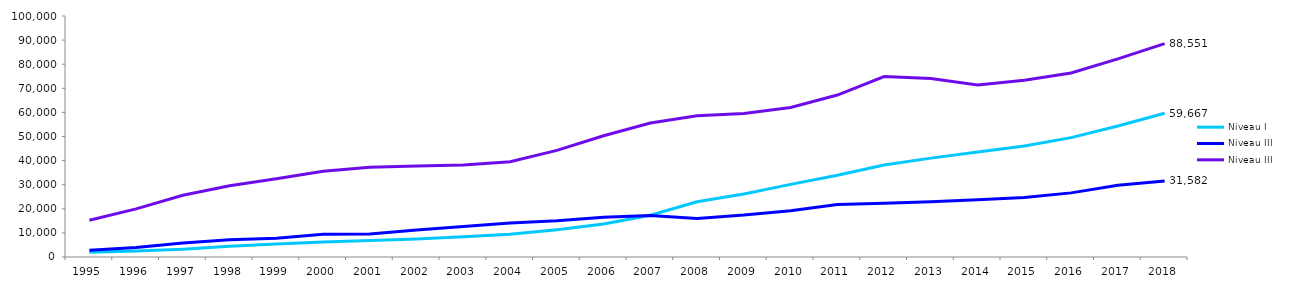
| Category | Niveau I | Niveau III |
|---|---|---|
| 1995 | 1948 | 15273 |
| 1996 | 2441 | 19952 |
| 1997 | 3250 | 25603 |
| 1998 | 4436 | 29581 |
| 1999 | 5397 | 32507 |
| 2000 | 6185 | 35553 |
| 2001 | 6852 | 37234 |
| 2002 | 7514 | 37751 |
| 2003 | 8378 | 38217 |
| 2004 | 9407 | 39560 |
| 2005 | 11341 | 44233 |
| 2006 | 13690 | 50316 |
| 2007 | 17340 | 55577 |
| 2008 | 22928 | 58572 |
| 2009 | 26156 | 59532 |
| 2010 | 30142 | 62074 |
| 2011 | 33931 | 67193 |
| 2012 | 38182 | 74868 |
| 2013 | 41027 | 74048 |
| 2014 | 43614 | 71419 |
| 2015 | 46041 | 73317 |
| 2016 | 49523 | 76326 |
| 2017 | 54364 | 82200 |
| 2018 | 59667 | 88551 |